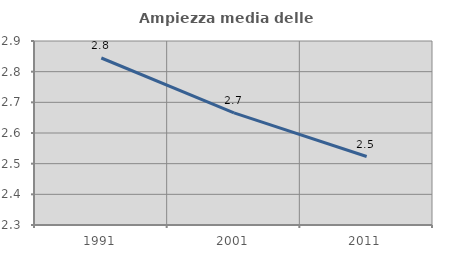
| Category | Ampiezza media delle famiglie |
|---|---|
| 1991.0 | 2.845 |
| 2001.0 | 2.665 |
| 2011.0 | 2.523 |